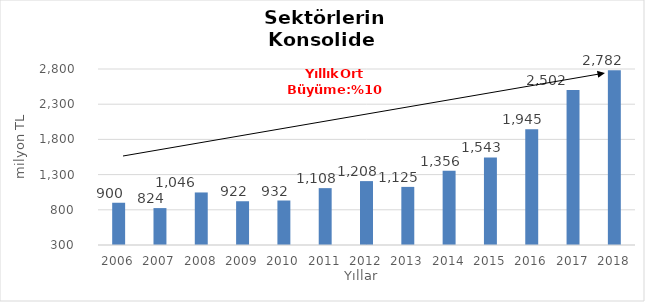
| Category | Toplam |
|---|---|
| 2006.0 | 900.249 |
| 2007.0 | 824.279 |
| 2008.0 | 1046.34 |
| 2009.0 | 921.592 |
| 2010.0 | 931.985 |
| 2011.0 | 1107.741 |
| 2012.0 | 1207.621 |
| 2013.0 | 1125.414 |
| 2014.0 | 1355.909 |
| 2015.0 | 1543 |
| 2016.0 | 1945 |
| 2017.0 | 2502 |
| 2018.0 | 2782 |